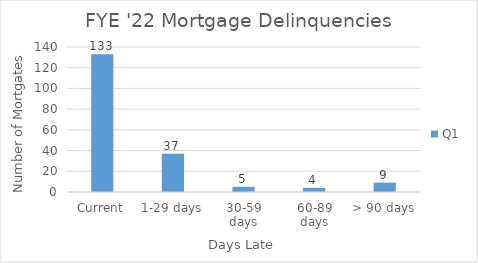
| Category | Q1 |
|---|---|
| Current | 133 |
| 1-29 days | 37 |
| 30-59 days | 5 |
| 60-89 days | 4 |
| > 90 days | 9 |